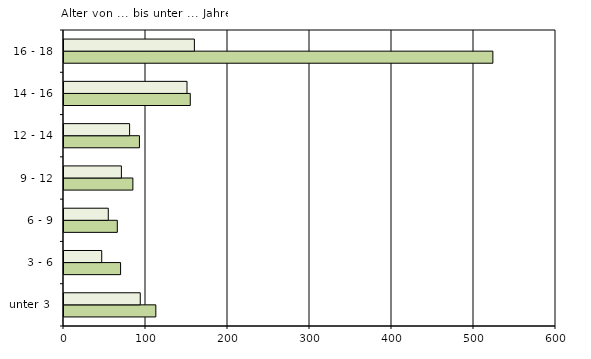
| Category | männlich | weiblich |
|---|---|---|
| unter 3  | 112 | 93 |
| 3 - 6 | 69 | 46 |
| 6 - 9 | 65 | 54 |
| 9 - 12 | 84 | 70 |
| 12 - 14 | 92 | 80 |
| 14 - 16 | 154 | 150 |
| 16 - 18 | 523 | 159 |